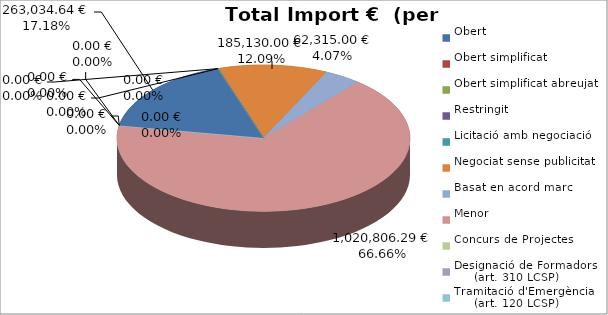
| Category | Total preu
(amb IVA) |
|---|---|
| Obert | 263034.64 |
| Obert simplificat | 0 |
| Obert simplificat abreujat | 0 |
| Restringit | 0 |
| Licitació amb negociació | 0 |
| Negociat sense publicitat | 185130 |
| Basat en acord marc | 62315 |
| Menor | 1020806.288 |
| Concurs de Projectes | 0 |
| Designació de Formadors
     (art. 310 LCSP) | 0 |
| Tramitació d'Emergència
     (art. 120 LCSP) | 0 |